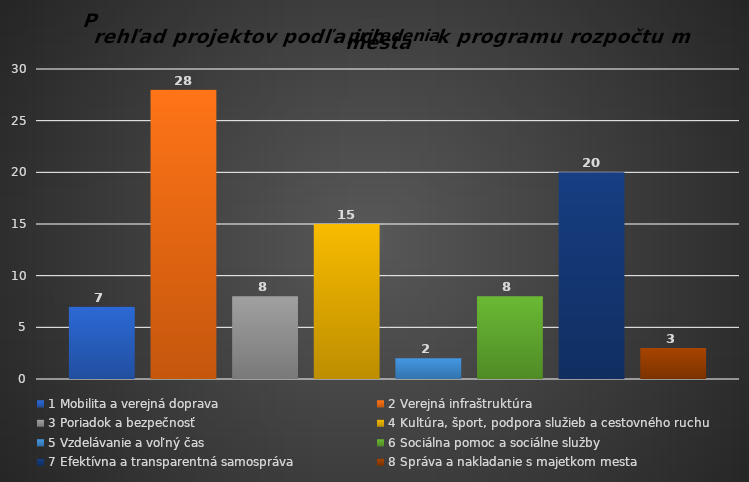
| Category | 1 | 2 | 3 | 4 | 5 | 6 | 7 | 8 |
|---|---|---|---|---|---|---|---|---|
| 0 | 7 | 28 | 8 | 15 | 2 | 8 | 20 | 3 |